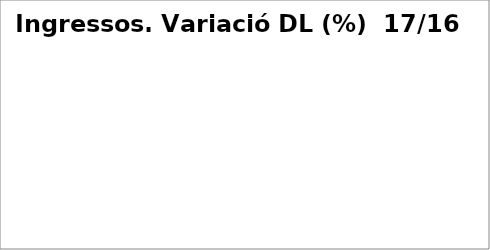
| Category | Series 0 |
|---|---|
| Impostos directes | 0.024 |
| Impostos indirectes | 0.082 |
| Taxes, preus públics i altres ingressos | -0.063 |
| Transferències corrents | 0.056 |
| Ingressos patrimonials | 0.276 |
| Venda d'inversions reals | 4.684 |
| Transferències de capital | -0.9 |
| Actius financers* | -1 |
| Passius financers | 0.288 |